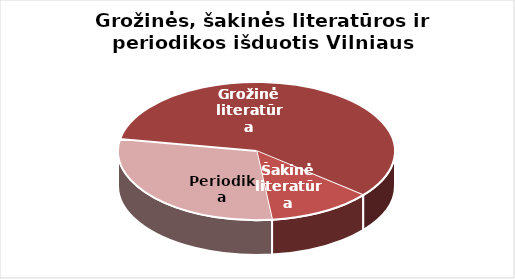
| Category | Series 0 |
|---|---|
| Grožinė literatūra | 1560340 |
| Šakinė literatūra | 326485 |
| Periodika | 792048 |